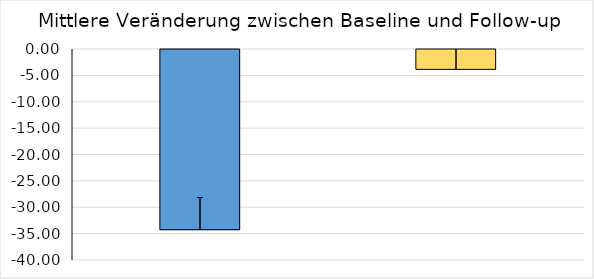
| Category | Series 0 |
|---|---|
| 0 | -34.157 |
| 1 | -3.766 |